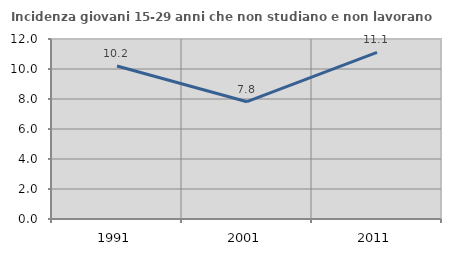
| Category | Incidenza giovani 15-29 anni che non studiano e non lavorano  |
|---|---|
| 1991.0 | 10.196 |
| 2001.0 | 7.821 |
| 2011.0 | 11.102 |